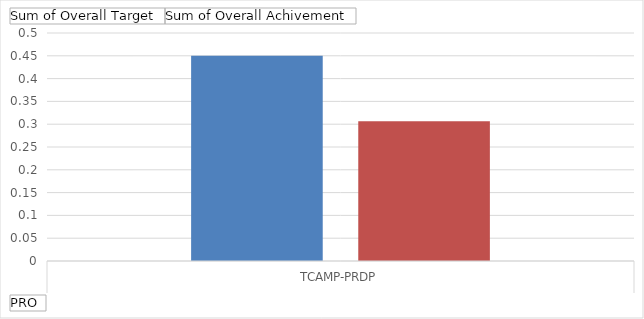
| Category | Sum of Overall Target | Sum of Overall Achivement |
|---|---|---|
| TCAMP-PRDP
 | 0.45 | 0.307 |